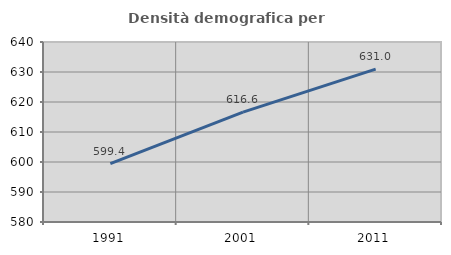
| Category | Densità demografica |
|---|---|
| 1991.0 | 599.429 |
| 2001.0 | 616.616 |
| 2011.0 | 630.978 |